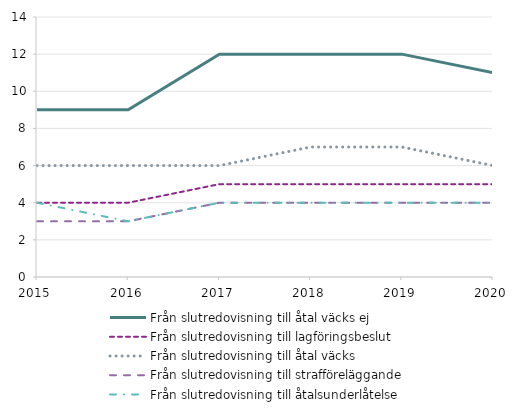
| Category | Från slutredovisning till åtal väcks ej | Från slutredovisning till lagföringsbeslut | Från slutredovisning till åtal väcks  | Från slutredovisning till strafföreläggande | Från slutredovisning till åtalsunderlåtelse |
|---|---|---|---|---|---|
| 2015 | 9 | 4 | 6 | 3 | 4 |
| 2016 | 9 | 4 | 6 | 3 | 3 |
| 2017 | 12 | 5 | 6 | 4 | 4 |
| 2018 | 12 | 5 | 7 | 4 | 4 |
| 2019 | 12 | 5 | 7 | 4 | 4 |
| 2020 | 11 | 5 | 6 | 4 | 4 |